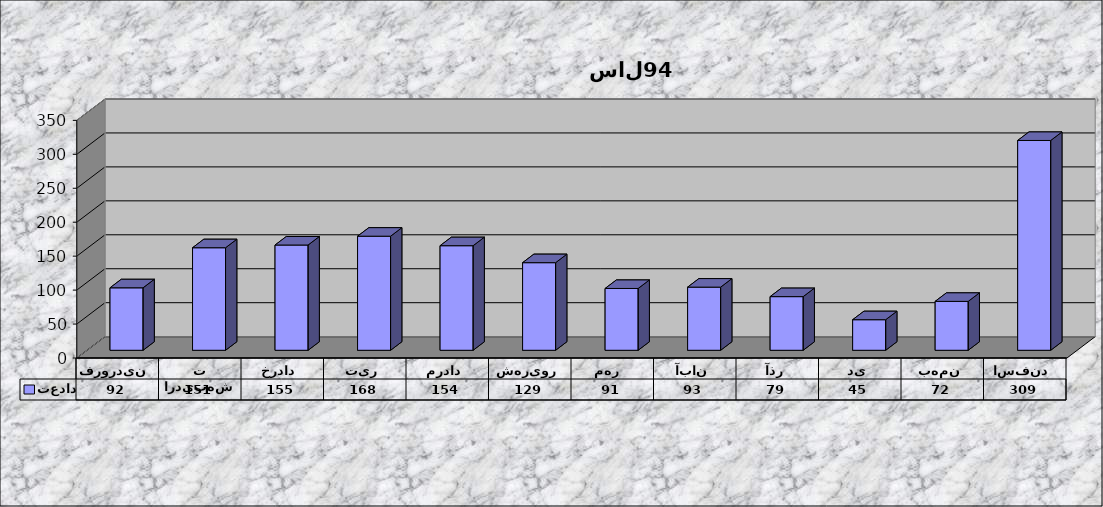
| Category | تعداد |
|---|---|
| فروردین | 92 |
| اردیبهشت | 151 |
| خرداد | 155 |
| تیر | 168 |
| مرداد | 154 |
| شهریور | 129 |
| مهر  | 91 |
| آبان | 93 |
| آذر | 79 |
| دی | 45 |
| بهمن | 72 |
| اسفند | 309 |